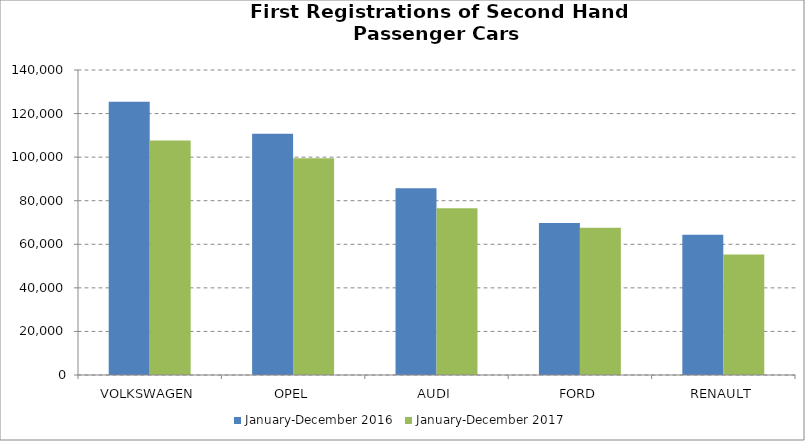
| Category | January-December 2016 | January-December 2017 |
|---|---|---|
| VOLKSWAGEN | 125447 | 107584 |
| OPEL | 110707 | 99501 |
| AUDI | 85696 | 76524 |
| FORD | 69811 | 67570 |
| RENAULT | 64422 | 55366 |